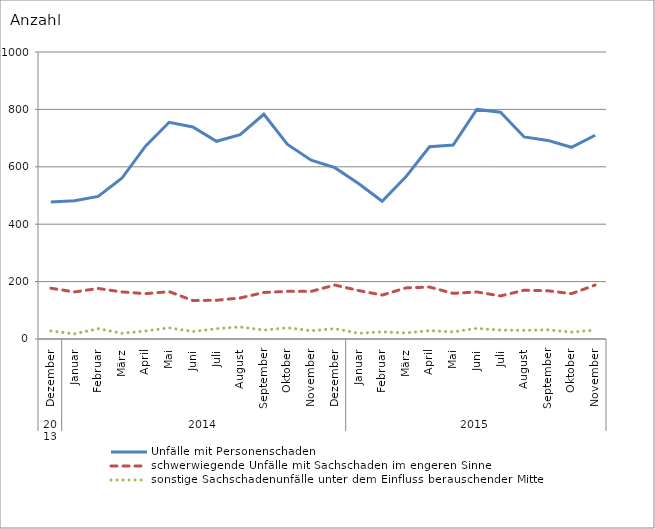
| Category | Unfälle mit Personenschaden | schwerwiegende Unfälle mit Sachschaden im engeren Sinne | sonstige Sachschadenunfälle unter dem Einfluss berauschender Mittel |
|---|---|---|---|
| 0 | 477 | 177 | 28 |
| 1 | 482 | 164 | 18 |
| 2 | 497 | 176 | 36 |
| 3 | 560 | 164 | 20 |
| 4 | 672 | 158 | 28 |
| 5 | 755 | 165 | 39 |
| 6 | 739 | 134 | 26 |
| 7 | 689 | 135 | 36 |
| 8 | 712 | 143 | 42 |
| 9 | 783 | 162 | 31 |
| 10 | 678 | 166 | 39 |
| 11 | 623 | 166 | 29 |
| 12 | 597 | 188 | 36 |
| 13 | 542 | 169 | 20 |
| 14 | 480 | 153 | 25 |
| 15 | 565 | 178 | 21 |
| 16 | 670 | 181 | 29 |
| 17 | 676 | 159 | 25 |
| 18 | 800 | 164 | 37 |
| 19 | 790 | 150 | 31 |
| 20 | 704 | 170 | 30 |
| 21 | 692 | 168 | 32 |
| 22 | 668 | 158 | 24 |
| 23 | 710 | 188 | 31 |